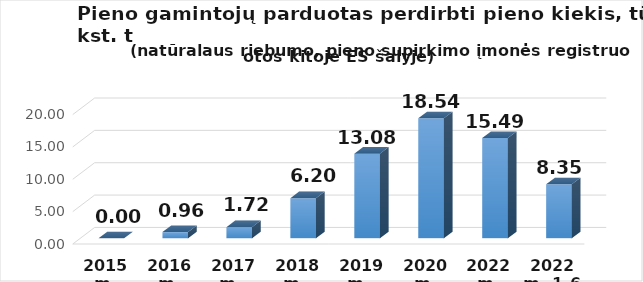
| Category | Kitoje ES šalyje registruotam ūkio subjektui  |
|---|---|
| 2015 m. | 0 |
| 2016 m. | 0.96 |
| 2017 m.  | 1.72 |
| 2018 m.  | 6.2 |
| 2019 m.  | 13.08 |
| 2020 m. | 18.54 |
| 2022 m. | 15.493 |
| 2022 m. 1-6 mėn. | 8.349 |